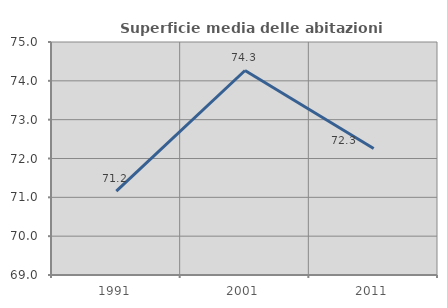
| Category | Superficie media delle abitazioni occupate |
|---|---|
| 1991.0 | 71.161 |
| 2001.0 | 74.266 |
| 2011.0 | 72.257 |